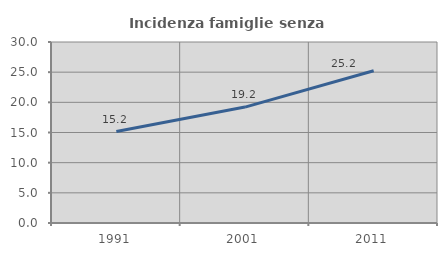
| Category | Incidenza famiglie senza nuclei |
|---|---|
| 1991.0 | 15.164 |
| 2001.0 | 19.21 |
| 2011.0 | 25.228 |